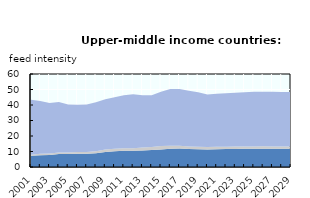
| Category | High protein feed | Medium protein feed | Low protein feed |
|---|---|---|---|
| 2001.0 | 7.282 | 0.633 | 35.54 |
| 2002.0 | 7.576 | 0.925 | 34.074 |
| 2003.0 | 7.702 | 0.938 | 32.728 |
| 2004.0 | 8.424 | 0.936 | 32.544 |
| 2005.0 | 8.347 | 1.018 | 30.887 |
| 2006.0 | 8.514 | 1.217 | 30.449 |
| 2007.0 | 8.482 | 1.208 | 30.642 |
| 2008.0 | 8.799 | 1.385 | 31.55 |
| 2009.0 | 9.653 | 1.603 | 32.516 |
| 2010.0 | 10.084 | 1.744 | 33.125 |
| 2011.0 | 10.488 | 1.641 | 34.131 |
| 2012.0 | 10.49 | 1.671 | 34.779 |
| 2013.0 | 10.654 | 1.918 | 33.683 |
| 2014.0 | 10.949 | 2.033 | 33.369 |
| 2015.0 | 11.306 | 2.175 | 35.079 |
| 2016.0 | 11.772 | 1.979 | 36.617 |
| 2017.0 | 11.989 | 1.773 | 36.593 |
| 2018.0 | 11.656 | 1.614 | 35.963 |
| 2019.0 | 11.473 | 1.582 | 35.153 |
| 2020.0 | 11.295 | 1.563 | 33.856 |
| 2021.0 | 11.506 | 1.548 | 34.155 |
| 2022.0 | 11.58 | 1.535 | 34.425 |
| 2023.0 | 11.649 | 1.526 | 34.772 |
| 2024.0 | 11.722 | 1.52 | 34.984 |
| 2025.0 | 11.798 | 1.507 | 35.252 |
| 2026.0 | 11.821 | 1.487 | 35.191 |
| 2027.0 | 11.836 | 1.469 | 35.222 |
| 2028.0 | 11.838 | 1.451 | 35.177 |
| 2029.0 | 11.834 | 1.432 | 35.126 |